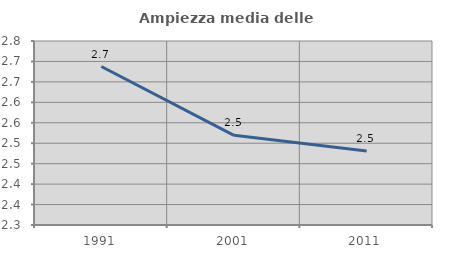
| Category | Ampiezza media delle famiglie |
|---|---|
| 1991.0 | 2.688 |
| 2001.0 | 2.519 |
| 2011.0 | 2.481 |